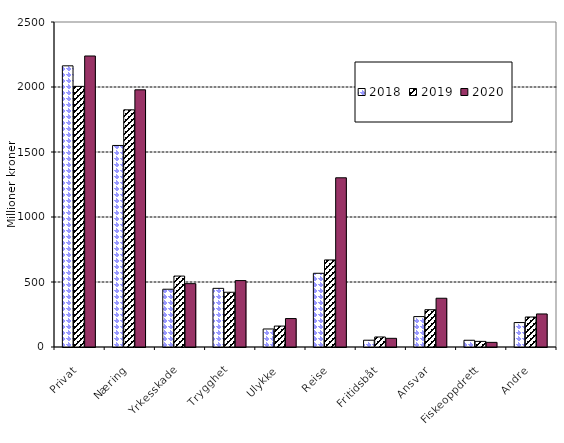
| Category | 2018 | 2019 | 2020 |
|---|---|---|---|
| Privat | 2162.865 | 2004.895 | 2238.505 |
| Næring | 1550.253 | 1824.397 | 1978.315 |
| Yrkesskade | 444.42 | 545.645 | 487.282 |
| Trygghet | 451.138 | 421.08 | 510.864 |
| Ulykke | 138.626 | 160.975 | 218.786 |
| Reise | 567.076 | 669.815 | 1301.658 |
| Fritidsbåt | 52.284 | 77.155 | 66.77 |
| Ansvar | 233.938 | 286.864 | 375.031 |
| Fiskeoppdrett | 51.827 | 43.233 | 35.68 |
| Andre | 188.083 | 230.761 | 254.161 |